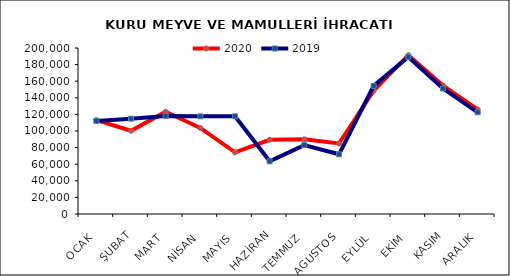
| Category | 2020 | 2019 |
|---|---|---|
| OCAK | 113205.425 | 112110.711 |
| ŞUBAT | 100301.63 | 114842.191 |
| MART | 123199.154 | 118196.583 |
| NİSAN | 103631.957 | 117650.87 |
| MAYIS | 74239.044 | 117731.31 |
| HAZİRAN | 89459.7 | 63501.197 |
| TEMMUZ | 89937.235 | 83021.467 |
| AGUSTOS | 84952.833 | 71929.895 |
| EYLÜL | 148595.482 | 154402.716 |
| EKİM | 191308.942 | 189264.082 |
| KASIM | 154733.85 | 151255.053 |
| ARALIK | 126009.094 | 122523.948 |